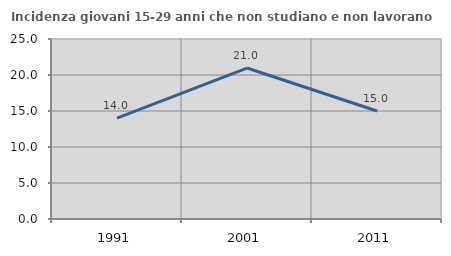
| Category | Incidenza giovani 15-29 anni che non studiano e non lavorano  |
|---|---|
| 1991.0 | 14.013 |
| 2001.0 | 20.968 |
| 2011.0 | 15 |